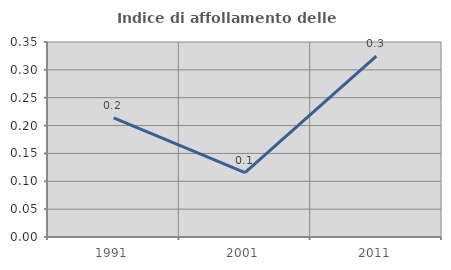
| Category | Indice di affollamento delle abitazioni  |
|---|---|
| 1991.0 | 0.214 |
| 2001.0 | 0.115 |
| 2011.0 | 0.324 |